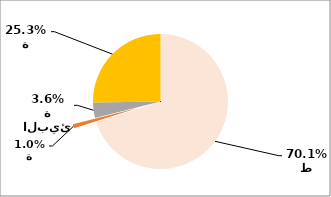
| Category | Series 0 |
|---|---|
| النفط | 8327389872 |
| الزراعة | 121074782 |
| الصحة / البيئة | 433427862 |
| التجارة | 3001025582 |